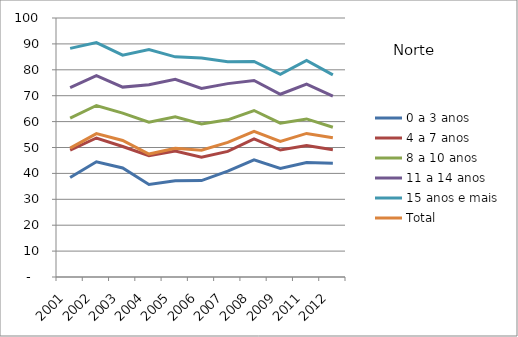
| Category | 0 a 3 anos | 4 a 7 anos | 8 a 10 anos | 11 a 14 anos | 15 anos e mais | Total |
|---|---|---|---|---|---|---|
| 2001.0 | 38.4 | 49.03 | 61.36 | 73.15 | 88.27 | 49.74 |
| 2002.0 | 44.49 | 53.67 | 66.22 | 77.71 | 90.52 | 55.36 |
| 2003.0 | 42.08 | 50.4 | 63.27 | 73.32 | 85.67 | 52.7 |
| 2004.0 | 35.71 | 46.81 | 59.75 | 74.26 | 87.78 | 47.46 |
| 2005.0 | 37.13 | 48.62 | 61.83 | 76.31 | 85 | 49.69 |
| 2006.0 | 37.24 | 46.29 | 59.12 | 72.82 | 84.55 | 48.97 |
| 2007.0 | 40.86 | 48.5 | 60.69 | 74.66 | 83.09 | 52 |
| 2008.0 | 45.24 | 53.34 | 64.28 | 75.86 | 83.2 | 56.23 |
| 2009.0 | 41.89 | 49.03 | 59.39 | 70.56 | 78.22 | 52.32 |
| 2011.0 | 44.24 | 50.8 | 61.03 | 74.51 | 83.59 | 55.43 |
| 2012.0 | 43.96 | 49.14 | 57.8 | 69.83 | 78.02 | 53.76 |